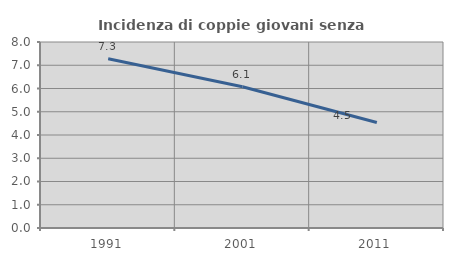
| Category | Incidenza di coppie giovani senza figli |
|---|---|
| 1991.0 | 7.281 |
| 2001.0 | 6.077 |
| 2011.0 | 4.535 |